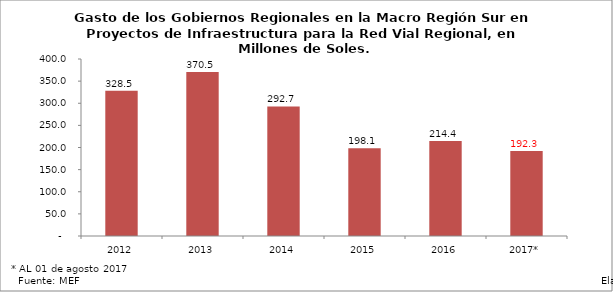
| Category | Series 1 |
|---|---|
| 2012 | 328.483 |
| 2013 | 370.474 |
| 2014 | 292.717 |
| 2015 | 198.106 |
| 2016 | 214.421 |
| 2017* | 192.333 |